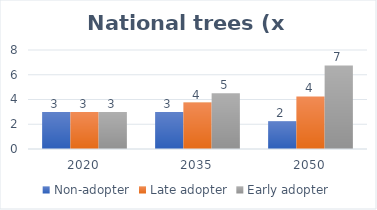
| Category | Non-adopter | Late adopter | Early adopter |
|---|---|---|---|
| 2020.0 | 3 | 3 | 3 |
| 2035.0 | 3 | 3.75 | 4.5 |
| 2050.0 | 2.25 | 4.25 | 6.75 |